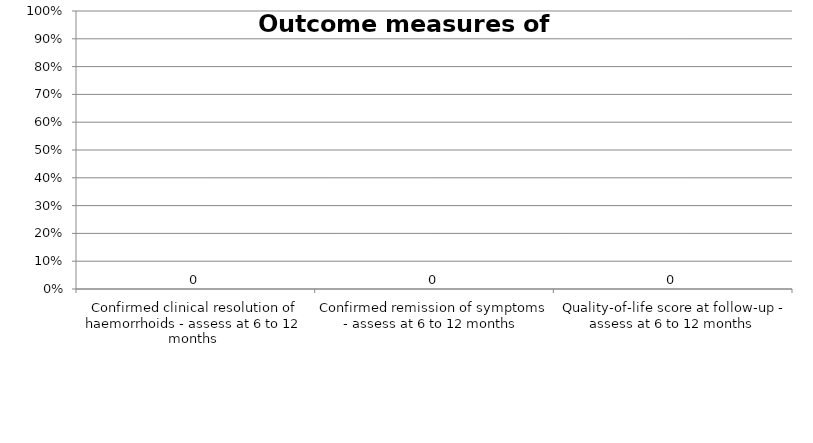
| Category | Series 0 |
|---|---|
| Confirmed clinical resolution of haemorrhoids - assess at 6 to 12 months  | 0 |
| Confirmed remission of symptoms - assess at 6 to 12 months  | 0 |
| Quality-of-life score at follow-up - assess at 6 to 12 months | 0 |